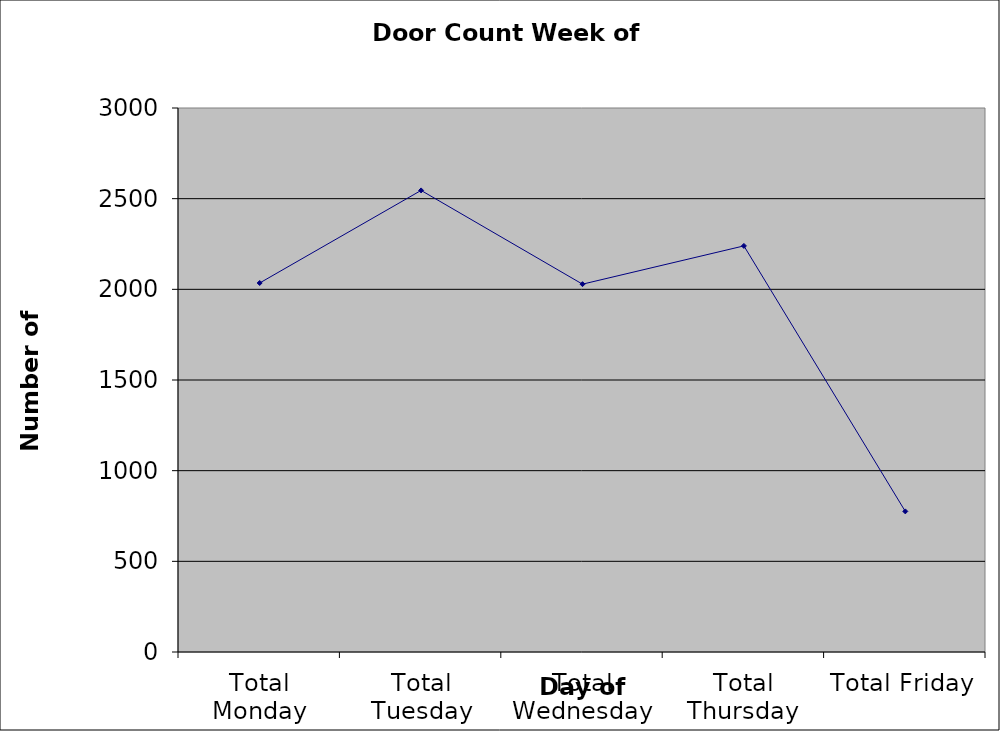
| Category | Series 0 |
|---|---|
| Total Monday | 2035 |
| Total Tuesday | 2545.5 |
| Total Wednesday | 2028.5 |
| Total Thursday | 2239.5 |
| Total Friday | 775.5 |